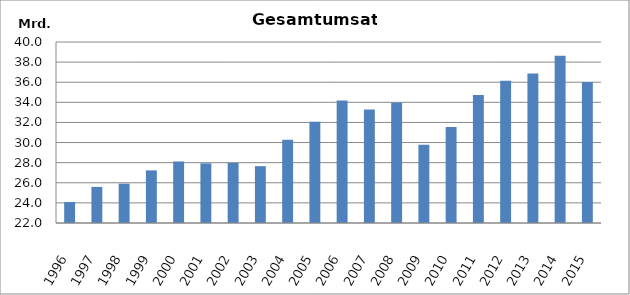
| Category | Umsatz |
|---|---|
| 1996.0 | 24088396 |
| 1997.0 | 25588482 |
| 1998.0 | 25911875 |
| 1999.0 | 27231996 |
| 2000.0 | 28121089 |
| 2001.0 | 27932719 |
| 2002.0 | 27976228 |
| 2003.0 | 27652647 |
| 2004.0 | 30278000 |
| 2005.0 | 32080721 |
| 2006.0 | 34189922 |
| 2007.0 | 33278221 |
| 2008.0 | 33993013 |
| 2009.0 | 29783049 |
| 2010.0 | 31557474.731 |
| 2011.0 | 34741088 |
| 2012.0 | 36149532.004 |
| 2013.0 | 36865319.524 |
| 2014.0 | 38623232.674 |
| 2015.0 | 36018872 |